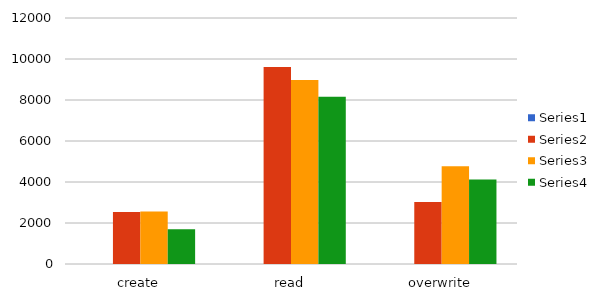
| Category | Series 0 | Series 1 | Series 2 | Series 3 |
|---|---|---|---|---|
| create |  | 2532 | 2556 | 1693 |
| read |  | 9609 | 8978 | 8158 |
| overwrite |  | 3021 | 4766 | 4120 |